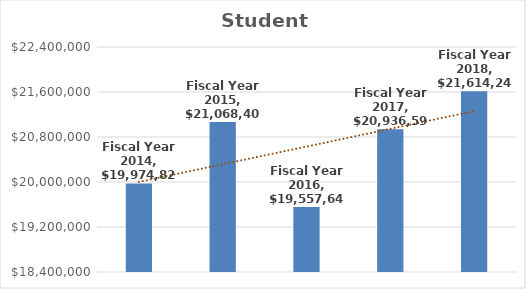
| Category | Student Services |
|---|---|
| Fiscal Year 2014 | 19974823 |
| Fiscal Year 2015 | 21068406 |
| Fiscal Year 2016 | 19557641 |
| Fiscal Year 2017 | 20936594 |
| Fiscal Year 2018 | 21614248 |